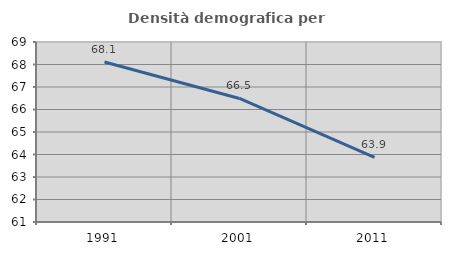
| Category | Densità demografica |
|---|---|
| 1991.0 | 68.113 |
| 2001.0 | 66.49 |
| 2011.0 | 63.875 |